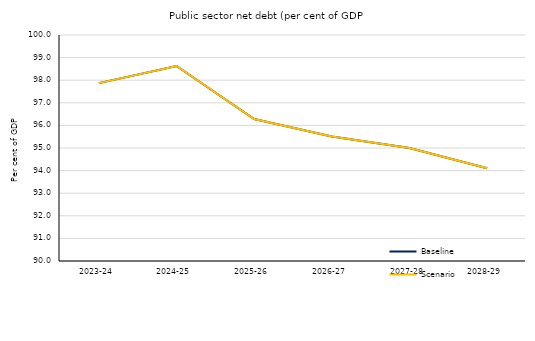
| Category | Baseline | Scenario |
|---|---|---|
| 2023-24 | 97.87 | 97.87 |
| 2024-25 | 98.627 | 98.627 |
| 2025-26 | 96.282 | 96.282 |
| 2026-27 | 95.51 | 95.51 |
| 2027-28 | 95.001 | 95.001 |
| 2028-29 | 94.106 | 94.106 |